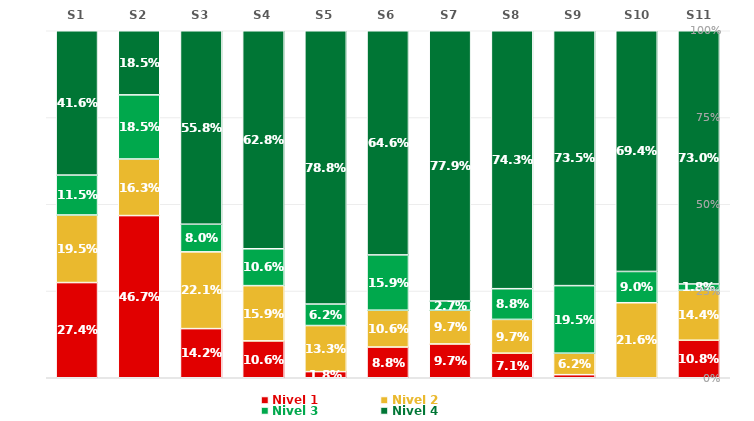
| Category | Nivel 1 | Nivel 2 | Nivel 3 | Nivel 4 |
|---|---|---|---|---|
| S1 | 0.274 | 0.195 | 0.115 | 0.416 |
| S2 | 0.467 | 0.163 | 0.185 | 0.185 |
| S3 | 0.142 | 0.221 | 0.08 | 0.558 |
| S4 | 0.106 | 0.159 | 0.106 | 0.628 |
| S5 | 0.018 | 0.133 | 0.062 | 0.788 |
| S6 | 0.088 | 0.106 | 0.159 | 0.646 |
| S7 | 0.097 | 0.097 | 0.027 | 0.779 |
| S8 | 0.071 | 0.097 | 0.088 | 0.743 |
| S9 | 0.009 | 0.062 | 0.195 | 0.735 |
| S10 | 0 | 0.216 | 0.09 | 0.694 |
| S11 | 0.108 | 0.144 | 0.018 | 0.73 |